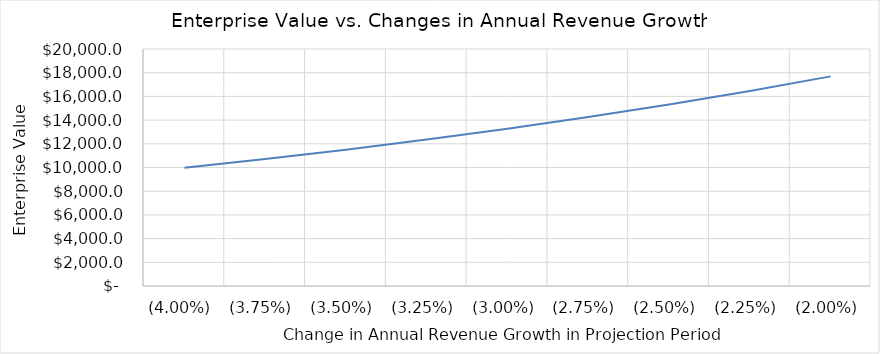
| Category | Series 0 |
|---|---|
| -0.04 | 9979.939 |
| -0.0375 | 10713.625 |
| -0.034999999999999996 | 11504.684 |
| -0.032499999999999994 | 12357.015 |
| -0.029999999999999995 | 13274.738 |
| -0.027499999999999997 | 14262.194 |
| -0.024999999999999998 | 15323.967 |
| -0.0225 | 16464.883 |
| -0.02 | 17690.027 |